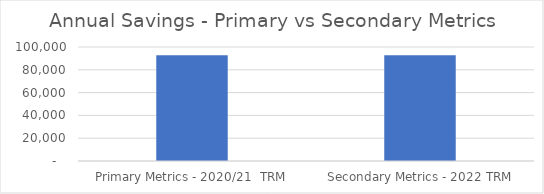
| Category | Series 0 |
|---|---|
| Primary Metrics - 2020/21  TRM | 92724.215 |
| Secondary Metrics - 2022 TRM | 92725.26 |